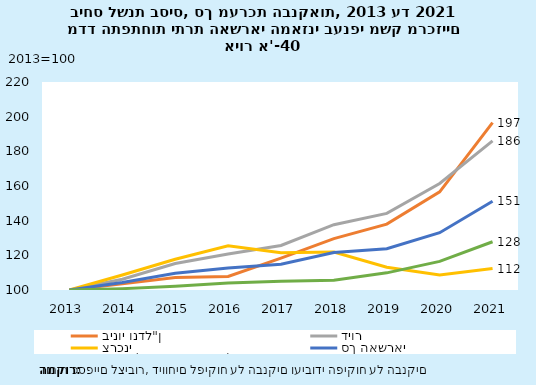
| Category | בינוי ונדל"ן | דיור | צרכני | סך האשראי | עסקי (ללא בינוי ונדל"ן) |
|---|---|---|---|---|---|
| 2013.0 | 100 | 100 | 100 | 100 | 100 |
| 2014.0 | 103.538 | 106.247 | 108.66 | 104.312 | 100.77 |
| 2015.0 | 107.174 | 115.266 | 117.735 | 109.688 | 102.159 |
| 2016.0 | 107.836 | 120.784 | 125.469 | 112.641 | 104.058 |
| 2017.0 | 118.396 | 125.678 | 121.498 | 114.833 | 105.042 |
| 2018.0 | 129.636 | 137.666 | 121.95 | 121.577 | 105.629 |
| 2019.0 | 138.021 | 144.198 | 113.176 | 123.813 | 109.89 |
| 2020.0 | 156.656 | 161.47 | 108.623 | 133.044 | 116.507 |
| 2021.0 | 196.58 | 186.052 | 112.39 | 151.162 | 127.853 |